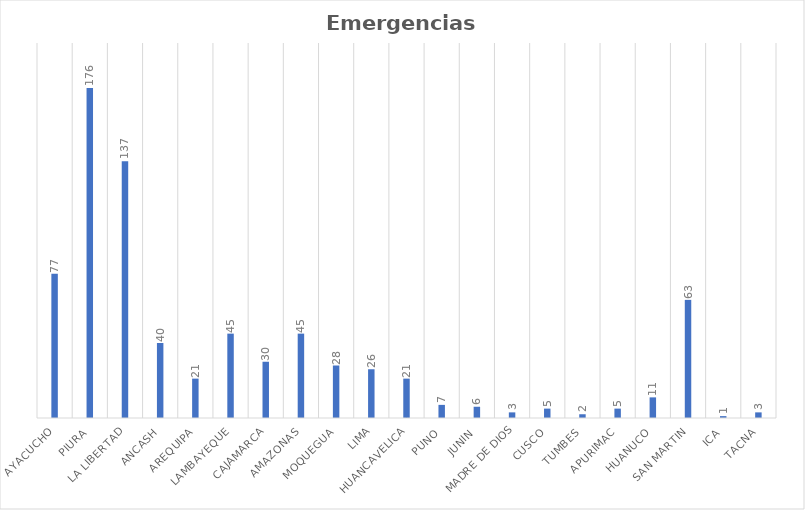
| Category | Series 0 |
|---|---|
| AYACUCHO | 77 |
| PIURA | 176 |
| LA LIBERTAD | 137 |
| ANCASH | 40 |
| AREQUIPA | 21 |
| LAMBAYEQUE | 45 |
| CAJAMARCA | 30 |
| AMAZONAS | 45 |
| MOQUEGUA | 28 |
| LIMA | 26 |
| HUANCAVELICA | 21 |
| PUNO | 7 |
| JUNIN | 6 |
| MADRE DE DIOS | 3 |
| CUSCO | 5 |
| TUMBES | 2 |
| APURIMAC | 5 |
| HUANUCO | 11 |
| SAN MARTIN | 63 |
| ICA | 1 |
| TACNA | 3 |